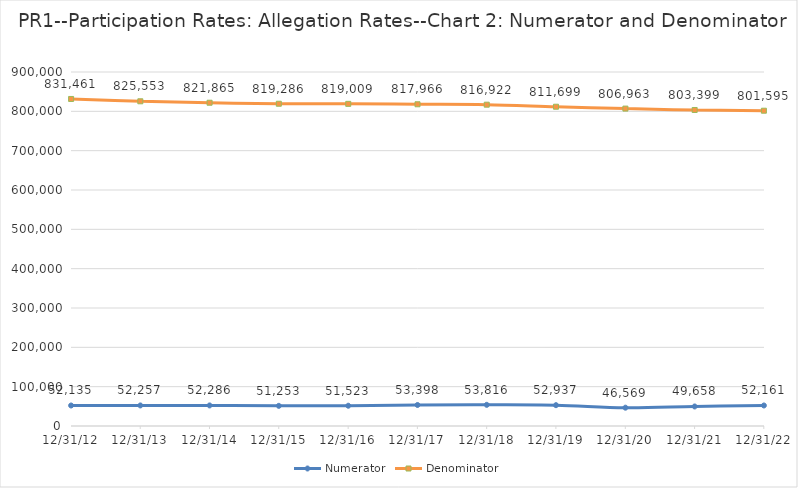
| Category | Numerator | Denominator |
|---|---|---|
| 2012-12-31 | 52135 | 831461 |
| 2013-12-31 | 52257 | 825553 |
| 2014-12-31 | 52286 | 821865 |
| 2015-12-31 | 51253 | 819286 |
| 2016-12-31 | 51523 | 819009 |
| 2017-12-31 | 53398 | 817966 |
| 2018-12-31 | 53816 | 816922 |
| 2019-12-31 | 52937 | 811699 |
| 2020-12-31 | 46569 | 806963 |
| 2021-12-31 | 49658 | 803399 |
| 2022-12-31 | 52161 | 801595 |